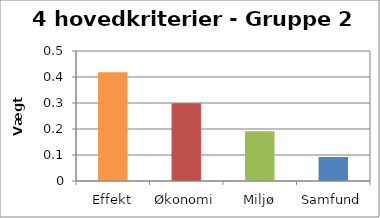
| Category | Vægt 2 |
|---|---|
| Effekt | 0.418 |
| Økonomi | 0.299 |
| Miljø | 0.191 |
| Samfund | 0.092 |